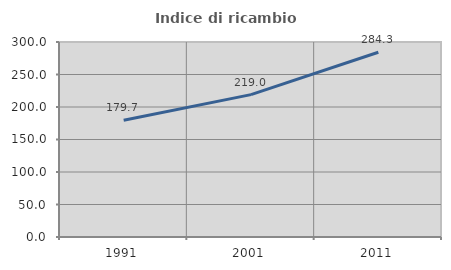
| Category | Indice di ricambio occupazionale  |
|---|---|
| 1991.0 | 179.733 |
| 2001.0 | 219.048 |
| 2011.0 | 284.3 |